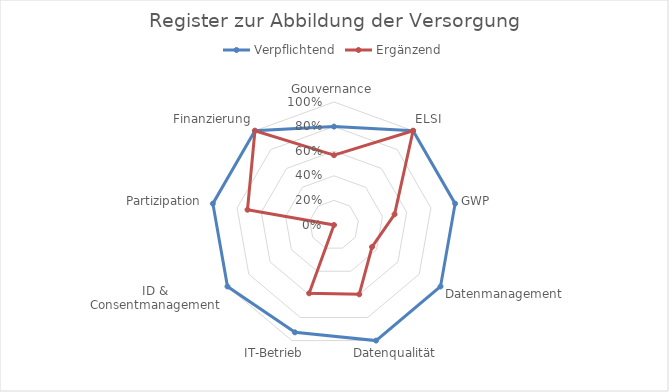
| Category | Verpflichtend | Ergänzend |
|---|---|---|
| Gouvernance | 0.8 | 0.568 |
| ELSI | 1 | 1 |
| GWP | 1 | 0.5 |
| Datenmanagement | 1 | 0.357 |
| Datenqualität | 1 | 0.6 |
| IT-Betrieb | 0.929 | 0.591 |
| ID & Consentmanagement | 1 | 0 |
| Partizipation | 1 | 0.714 |
| Finanzierung | 1 | 1 |